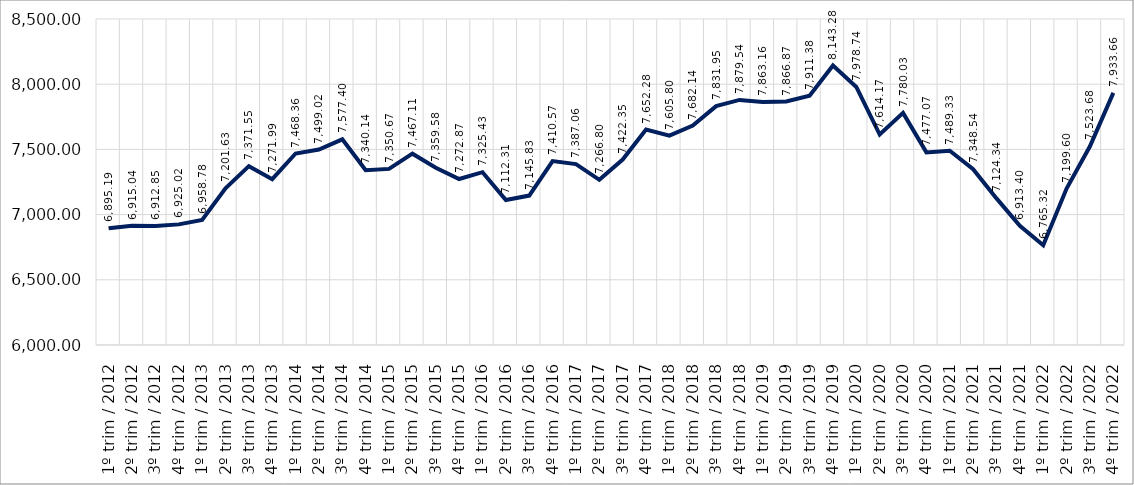
| Category | 40% mais pobres |
|---|---|
| 1º trim / 2012 | 6895.194 |
| 2º trim / 2012 | 6915.035 |
| 3º trim / 2012 | 6912.85 |
| 4º trim / 2012 | 6925.018 |
| 1º trim / 2013 | 6958.776 |
| 2º trim / 2013 | 7201.629 |
| 3º trim / 2013 | 7371.548 |
| 4º trim / 2013 | 7271.993 |
| 1º trim / 2014 | 7468.358 |
| 2º trim / 2014 | 7499.024 |
| 3º trim / 2014 | 7577.398 |
| 4º trim / 2014 | 7340.136 |
| 1º trim / 2015 | 7350.665 |
| 2º trim / 2015 | 7467.106 |
| 3º trim / 2015 | 7359.579 |
| 4º trim / 2015 | 7272.869 |
| 1º trim / 2016 | 7325.427 |
| 2º trim / 2016 | 7112.307 |
| 3º trim / 2016 | 7145.828 |
| 4º trim / 2016 | 7410.565 |
| 1º trim / 2017 | 7387.061 |
| 2º trim / 2017 | 7266.796 |
| 3º trim / 2017 | 7422.347 |
| 4º trim / 2017 | 7652.278 |
| 1º trim / 2018 | 7605.801 |
| 2º trim / 2018 | 7682.137 |
| 3º trim / 2018 | 7831.953 |
| 4º trim / 2018 | 7879.54 |
| 1º trim / 2019 | 7863.158 |
| 2º trim / 2019 | 7866.873 |
| 3º trim / 2019 | 7911.383 |
| 4º trim / 2019 | 8143.276 |
| 1º trim / 2020 | 7978.738 |
| 2º trim / 2020 | 7614.17 |
| 3º trim / 2020 | 7780.031 |
| 4º trim / 2020 | 7477.069 |
| 1º trim / 2021 | 7489.328 |
| 2º trim / 2021 | 7348.538 |
| 3º trim / 2021 | 7124.34 |
| 4º trim / 2021 | 6913.401 |
| 1º trim / 2022 | 6765.323 |
| 2º trim / 2022 | 7199.598 |
| 3º trim / 2022 | 7523.681 |
| 4º trim / 2022 | 7933.658 |